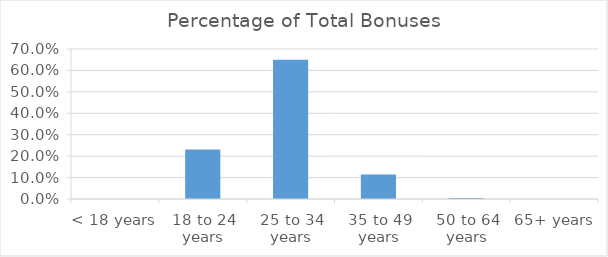
| Category | Percentage of Total Bonuses (%) |
|---|---|
| < 18 years | 0 |
| 18 to 24 years | 0.231 |
| 25 to 34 years | 0.65 |
| 35 to 49 years | 0.114 |
| 50 to 64 years | 0.005 |
| 65+ years | 0 |